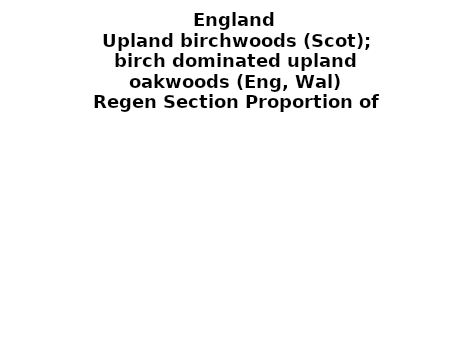
| Category | Upland birchwoods (Scot); birch dominated upland oakwoods (Eng, Wal) |
|---|---|
| None | 0.063 |
| Seedlings only | 0 |
| Seedlings, saplings only | 0.058 |
| Seedlings, saplings, <7 cm trees | 0.16 |
| Saplings only | 0.242 |
| <7 cm trees, seedlings only | 0 |
| <7 cm trees, saplings only | 0.373 |
| <7 cm Trees only | 0.105 |